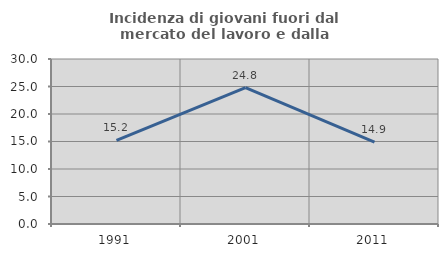
| Category | Incidenza di giovani fuori dal mercato del lavoro e dalla formazione  |
|---|---|
| 1991.0 | 15.224 |
| 2001.0 | 24.806 |
| 2011.0 | 14.894 |